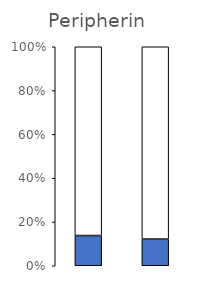
| Category | Series 0 | Series 1 |
|---|---|---|
| Chimpanzee | 13.8 | 86.2 |
| Human | 12.19 | 87.81 |